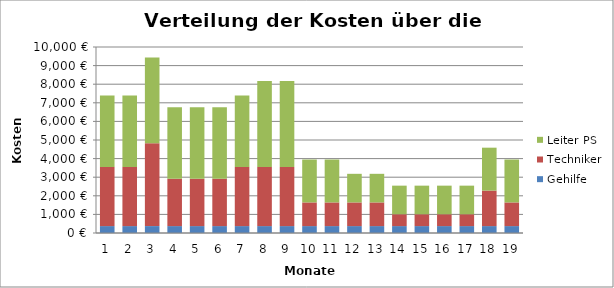
| Category | Gehilfe | Techniker | Leiter PS |
|---|---|---|---|
| 0 | 371.211 | 3181.805 | 3844.681 |
| 1 | 371.211 | 3181.805 | 3844.681 |
| 2 | 371.211 | 4454.527 | 4613.617 |
| 3 | 371.211 | 2545.444 | 3844.681 |
| 4 | 371.211 | 2545.444 | 3844.681 |
| 5 | 371.211 | 2545.444 | 3844.681 |
| 6 | 371.211 | 3181.805 | 3844.681 |
| 7 | 371.211 | 3181.805 | 4613.617 |
| 8 | 371.211 | 3181.805 | 4613.617 |
| 9 | 371.211 | 1272.722 | 2306.809 |
| 10 | 371.211 | 1272.722 | 2306.809 |
| 11 | 371.211 | 1272.722 | 1537.872 |
| 12 | 371.211 | 1272.722 | 1537.872 |
| 13 | 371.211 | 636.361 | 1537.872 |
| 14 | 371.211 | 636.361 | 1537.872 |
| 15 | 371.211 | 636.361 | 1537.872 |
| 16 | 371.211 | 636.361 | 1537.872 |
| 17 | 371.211 | 1909.083 | 2306.809 |
| 18 | 371.211 | 1272.722 | 2306.809 |